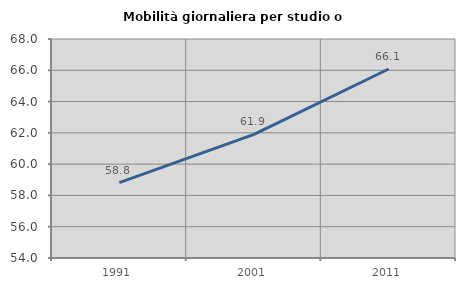
| Category | Mobilità giornaliera per studio o lavoro |
|---|---|
| 1991.0 | 58.818 |
| 2001.0 | 61.904 |
| 2011.0 | 66.084 |